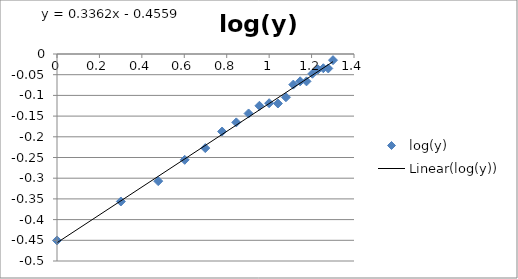
| Category | log(y) |
|---|---|
| 0.0 | -0.45 |
| 0.3010299956639812 | -0.356 |
| 0.47712125471966244 | -0.307 |
| 0.6020599913279624 | -0.256 |
| 0.6989700043360189 | -0.227 |
| 0.7781512503836436 | -0.187 |
| 0.8450980400142568 | -0.165 |
| 0.9030899869919435 | -0.144 |
| 0.9542425094393249 | -0.125 |
| 1.0 | -0.119 |
| 1.0413926851582251 | -0.12 |
| 1.0791812460476249 | -0.104 |
| 1.1139433523068367 | -0.074 |
| 1.146128035678238 | -0.066 |
| 1.1760912590556813 | -0.066 |
| 1.2041199826559248 | -0.048 |
| 1.2304489213782739 | -0.037 |
| 1.255272505103306 | -0.034 |
| 1.2787536009528289 | -0.035 |
| 1.3010299956639813 | -0.015 |